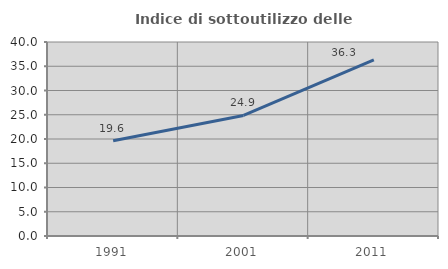
| Category | Indice di sottoutilizzo delle abitazioni  |
|---|---|
| 1991.0 | 19.63 |
| 2001.0 | 24.852 |
| 2011.0 | 36.327 |